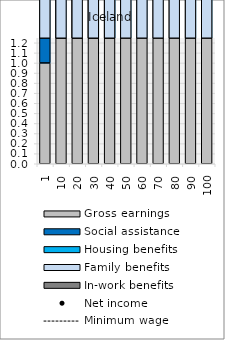
| Category | Gross earnings | Social assistance | Housing benefits | Family benefits | In-work benefits |
|---|---|---|---|---|---|
| 1.0 | 1 | 40.206 | 6.358 | 8.591 | 0 |
| 10.0 | 10 | 31.206 | 6.387 | 8.591 | 0 |
| 20.0 | 20 | 21.206 | 6.419 | 8.591 | 0 |
| 30.0 | 30 | 11.206 | 6.451 | 8.591 | 0 |
| 40.0 | 40 | 1.206 | 6.484 | 8.591 | 0 |
| 50.0 | 50 | 0 | 5.809 | 8.591 | 0 |
| 60.0 | 60 | 0 | 5.037 | 8.591 | 0 |
| 70.0 | 70 | 0 | 4.265 | 8.159 | 0 |
| 80.0 | 80 | 0 | 3.493 | 7.559 | 0 |
| 90.0 | 90 | 0 | 2.721 | 6.959 | 0 |
| 100.0 | 100 | 0 | 1.95 | 6.359 | 0 |